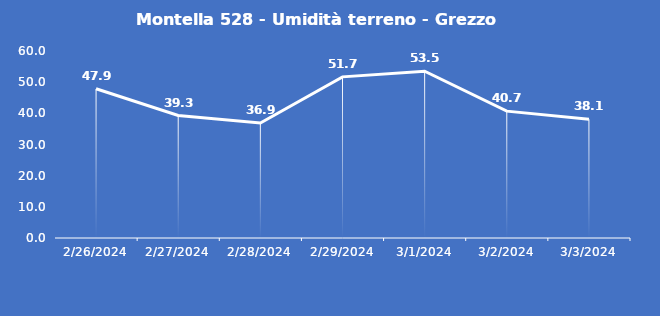
| Category | Montella 528 - Umidità terreno - Grezzo (%VWC) |
|---|---|
| 2/26/24 | 47.9 |
| 2/27/24 | 39.3 |
| 2/28/24 | 36.9 |
| 2/29/24 | 51.7 |
| 3/1/24 | 53.5 |
| 3/2/24 | 40.7 |
| 3/3/24 | 38.1 |